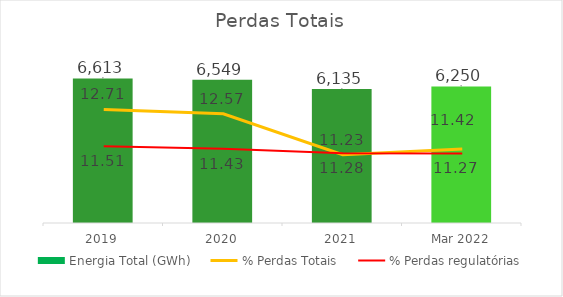
| Category | Energia Total (GWh) |
|---|---|
| 2019 | 6613 |
| 2020 | 6549 |
| 2021 | 6135 |
| Mar 2022 | 6250 |